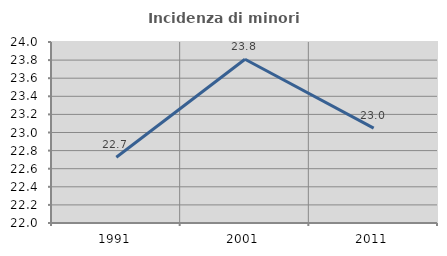
| Category | Incidenza di minori stranieri |
|---|---|
| 1991.0 | 22.727 |
| 2001.0 | 23.81 |
| 2011.0 | 23.048 |